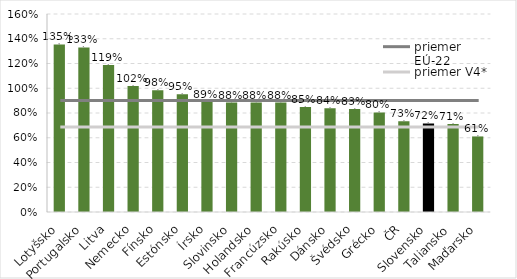
| Category | Series 0 |
|---|---|
| Lotyšsko | 1.354 |
| Portugalsko | 1.33 |
| Litva | 1.187 |
| Nemecko | 1.018 |
| Fínsko | 0.984 |
| Estónsko | 0.952 |
| Írsko | 0.891 |
| Slovinsko | 0.885 |
| Holandsko | 0.885 |
| Francúzsko | 0.884 |
| Rakúsko | 0.849 |
| Dánsko | 0.838 |
| Švédsko | 0.832 |
| Grécko | 0.804 |
| ČR | 0.733 |
| Slovensko | 0.716 |
| Taliansko | 0.71 |
| Maďarsko | 0.611 |